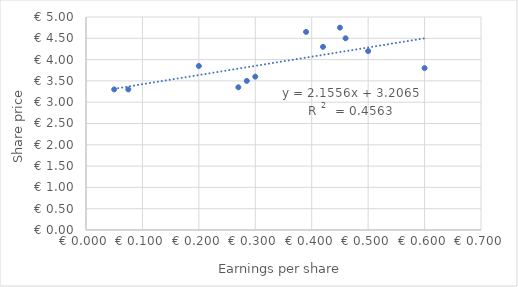
| Category | Series 0 |
|---|---|
| 0.28500000000000003 | 3.5 |
| 0.27 | 3.35 |
| 0.05 | 3.3 |
| 0.075 | 3.3 |
| 0.3 | 3.6 |
| 0.6 | 3.8 |
| 0.2 | 3.85 |
| 0.5 | 4.2 |
| 0.42 | 4.3 |
| 0.46 | 4.5 |
| 0.39 | 4.65 |
| 0.45 | 4.75 |